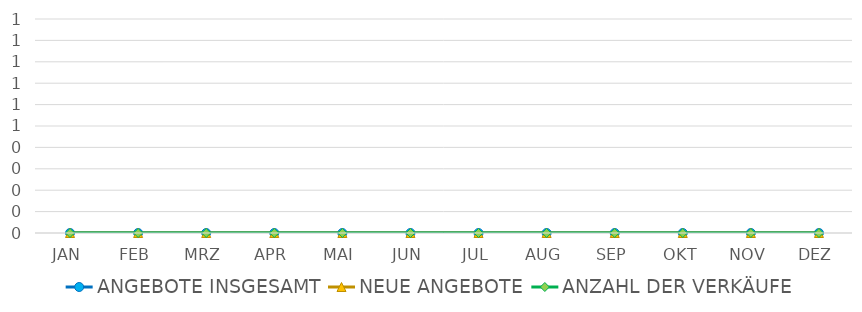
| Category | ANGEBOTE INSGESAMT | NEUE ANGEBOTE | ANZAHL DER VERKÄUFE |
|---|---|---|---|
| JAN | 0 | 0 | 0 |
| FEB | 0 | 0 | 0 |
| MRZ | 0 | 0 | 0 |
| APR | 0 | 0 | 0 |
| MAI | 0 | 0 | 0 |
| JUN | 0 | 0 | 0 |
| JUL | 0 | 0 | 0 |
| AUG | 0 | 0 | 0 |
| SEP | 0 | 0 | 0 |
| OKT | 0 | 0 | 0 |
| NOV | 0 | 0 | 0 |
| DEZ | 0 | 0 | 0 |